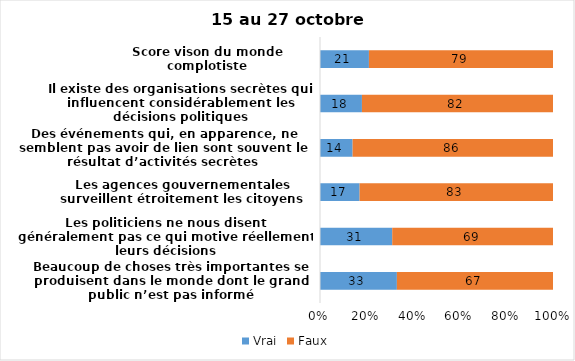
| Category | Vrai | Faux |
|---|---|---|
| Beaucoup de choses très importantes se produisent dans le monde dont le grand public n’est pas informé | 33 | 67 |
| Les politiciens ne nous disent généralement pas ce qui motive réellement leurs décisions | 31 | 69 |
| Les agences gouvernementales surveillent étroitement les citoyens | 17 | 83 |
| Des événements qui, en apparence, ne semblent pas avoir de lien sont souvent le résultat d’activités secrètes | 14 | 86 |
| Il existe des organisations secrètes qui influencent considérablement les décisions politiques | 18 | 82 |
| Score vison du monde complotiste | 21 | 79 |